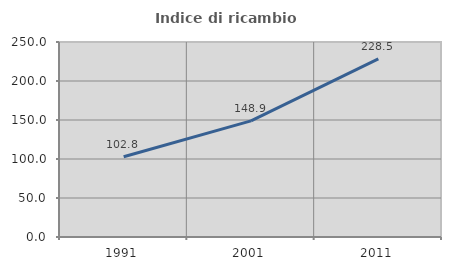
| Category | Indice di ricambio occupazionale  |
|---|---|
| 1991.0 | 102.798 |
| 2001.0 | 148.91 |
| 2011.0 | 228.453 |